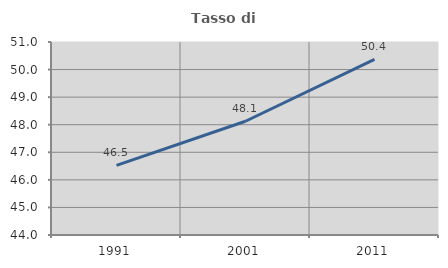
| Category | Tasso di occupazione   |
|---|---|
| 1991.0 | 46.524 |
| 2001.0 | 48.125 |
| 2011.0 | 50.369 |